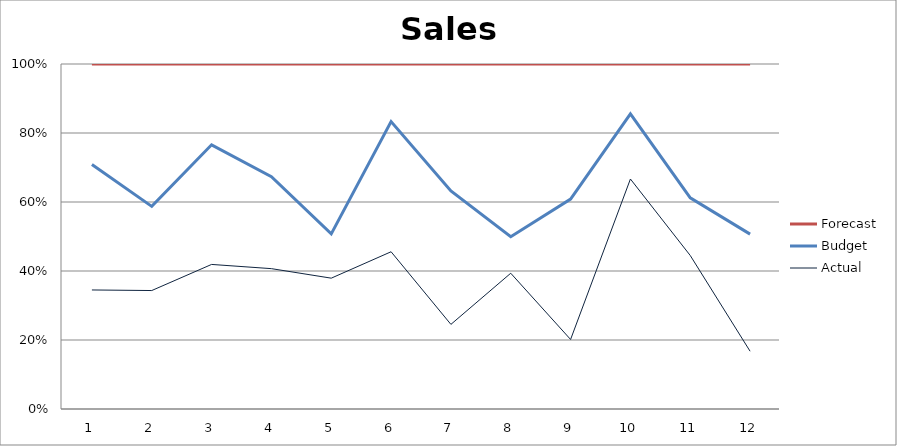
| Category | Actual | Budget | Forecast |
|---|---|---|---|
| 0 | 2750 | 2900 | 2320 |
| 1 | 2280 | 1620 | 2740 |
| 2 | 2200 | 1820 | 1230 |
| 3 | 2750 | 1800 | 2210 |
| 4 | 2010 | 680 | 2610 |
| 5 | 2730 | 2260 | 1000 |
| 6 | 1680 | 2650 | 2520 |
| 7 | 2310 | 620 | 2940 |
| 8 | 1600 | 3230 | 3110 |
| 9 | 3040 | 860 | 660 |
| 10 | 3350 | 1260 | 2920 |
| 11 | 720 | 1460 | 2120 |